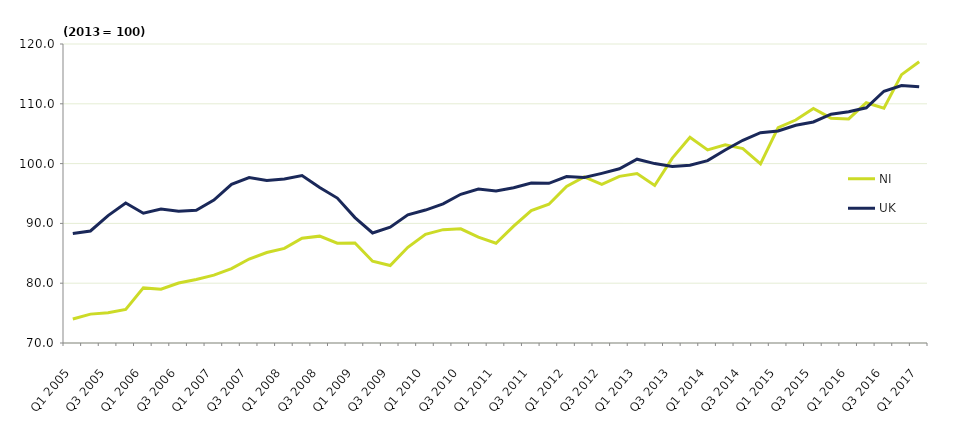
| Category | NI  | UK  |
|---|---|---|
| Q1 2005 | 74.008 | 88.3 |
| Q2 2005 | 74.83 | 88.733 |
| Q3 2005 | 75.052 | 91.3 |
| Q4 2005 | 75.626 | 93.4 |
| Q1 2006 | 79.215 | 91.7 |
| Q2 2006 | 79.01 | 92.4 |
| Q3 2006 | 80.03 | 92.033 |
| Q4 2006 | 80.633 | 92.2 |
| Q1 2007 | 81.34 | 93.9 |
| Q2 2007 | 82.43 | 96.533 |
| Q3 2007 | 84.041 | 97.667 |
| Q4 2007 | 85.132 | 97.167 |
| Q1 2008 | 85.815 | 97.433 |
| Q2 2008 | 87.514 | 98 |
| Q3 2008 | 87.868 | 96 |
| Q4 2008 | 86.696 | 94.233 |
| Q1 2009 | 86.71 | 90.967 |
| Q2 2009 | 83.674 | 88.4 |
| Q3 2009 | 82.95 | 89.367 |
| Q4 2009 | 86.005 | 91.433 |
| Q1 2010 | 88.181 | 92.233 |
| Q2 2010 | 88.953 | 93.267 |
| Q3 2010 | 89.089 | 94.867 |
| Q4 2010 | 87.7 | 95.733 |
| Q1 2011 | 86.681 | 95.433 |
| Q2 2011 | 89.537 | 95.967 |
| Q3 2011 | 92.147 | 96.767 |
| Q4 2011 | 93.201 | 96.7 |
| Q1 2012 | 96.194 | 97.833 |
| Q2 2012 | 97.777 | 97.667 |
| Q3 2012 | 96.543 | 98.367 |
| Q4 2012 | 97.864 | 99.133 |
| Q1 2013 | 98.349 | 100.733 |
| Q2 2013 | 96.341 | 100 |
| Q3 2013 | 100.921 | 99.533 |
| Q4 2013 | 104.389 | 99.733 |
| Q1 2014 | 102.297 | 100.5 |
| Q2 2014 | 103.151 | 102.267 |
| Q3 2014 | 102.507 | 103.9 |
| Q4 2014 | 99.963 | 105.167 |
| Q1 2015 | 106.03 | 105.467 |
| Q2 2015 | 107.287 | 106.4 |
| Q3 2015 | 109.226 | 106.967 |
| Q4 2015 | 107.596 | 108.267 |
| Q1 2016 | 107.463 | 108.667 |
| Q2 2016 | 110.18 | 109.333 |
| Q3 2016 | 109.282 | 112.1 |
| Q4 2016 | 114.873 | 113.067 |
| Q1 2017 | 117.038 | 112.833 |